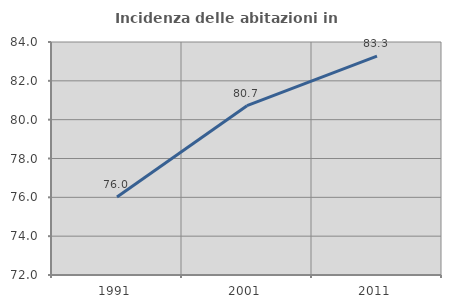
| Category | Incidenza delle abitazioni in proprietà  |
|---|---|
| 1991.0 | 76.02 |
| 2001.0 | 80.719 |
| 2011.0 | 83.274 |